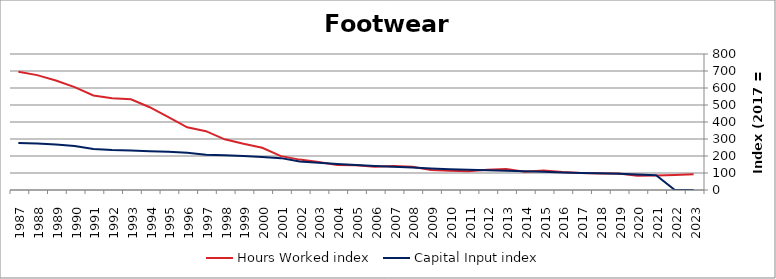
| Category | Hours Worked index | Capital Input index |
|---|---|---|
| 2023.0 | 92.117 | 0 |
| 2022.0 | 88.79 | 0 |
| 2021.0 | 84.883 | 86.824 |
| 2020.0 | 84.442 | 91.895 |
| 2019.0 | 97.477 | 96.058 |
| 2018.0 | 97.501 | 98.425 |
| 2017.0 | 100 | 100 |
| 2016.0 | 105.694 | 103.401 |
| 2015.0 | 114.207 | 106.792 |
| 2014.0 | 108.094 | 109.828 |
| 2013.0 | 123.179 | 112.874 |
| 2012.0 | 119.511 | 115.771 |
| 2011.0 | 110.982 | 118.949 |
| 2010.0 | 113.62 | 122.031 |
| 2009.0 | 117.028 | 126.605 |
| 2008.0 | 137.387 | 131.958 |
| 2007.0 | 141.477 | 136.517 |
| 2006.0 | 137.46 | 141.704 |
| 2005.0 | 145.253 | 146.815 |
| 2004.0 | 147.708 | 152.751 |
| 2003.0 | 164.815 | 159.664 |
| 2002.0 | 178.739 | 167.278 |
| 2001.0 | 199.062 | 187.483 |
| 2000.0 | 248.573 | 194.164 |
| 1999.0 | 272.1 | 199.839 |
| 1998.0 | 298.273 | 204.277 |
| 1997.0 | 345.872 | 208.049 |
| 1996.0 | 369.069 | 218.693 |
| 1995.0 | 428.631 | 224.713 |
| 1994.0 | 486.879 | 228.269 |
| 1993.0 | 534.06 | 232.036 |
| 1992.0 | 539.535 | 234.801 |
| 1991.0 | 556.005 | 240.945 |
| 1990.0 | 605.335 | 258.669 |
| 1989.0 | 643.751 | 267.537 |
| 1988.0 | 675.697 | 274.033 |
| 1987.0 | 695.236 | 275.927 |